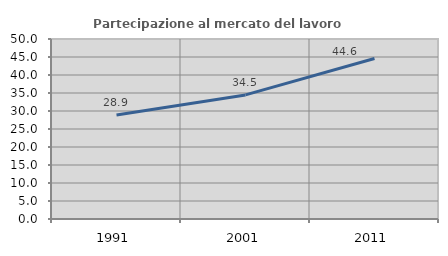
| Category | Partecipazione al mercato del lavoro  femminile |
|---|---|
| 1991.0 | 28.914 |
| 2001.0 | 34.465 |
| 2011.0 | 44.569 |